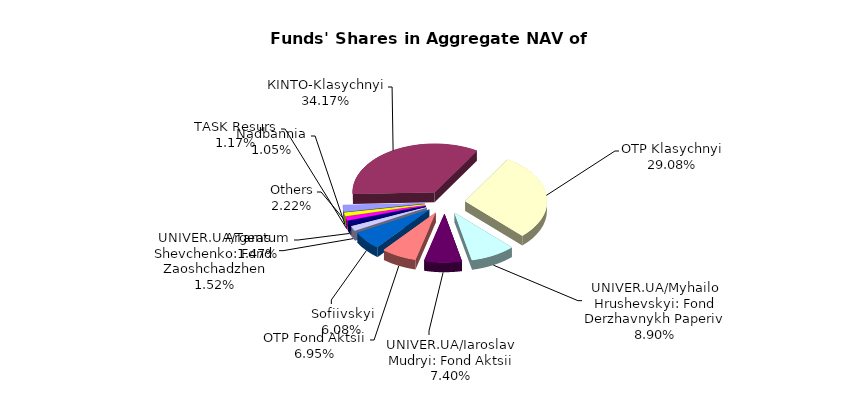
| Category | Series 0 | Series 1 |
|---|---|---|
| Others | 1988615.56 | 0.018 |
| КІNТО-Klasychnyi | 30630518.99 | 0.282 |
| OTP Klasychnyi | 26074277.39 | 0.24 |
| UNIVER.UA/Myhailo Hrushevskyi: Fond Derzhavnykh Paperiv | 7976471.37 | 0.073 |
| UNIVER.UA/Iaroslav Mudryi: Fond Aktsii | 6630772.23 | 0.061 |
| OTP Fond Aktsii | 6229451.08 | 0.057 |
| Sofiivskyi | 5449541.03 | 0.05 |
| UNIVER.UA/Taras Shevchenko: Fond Zaoshchadzhen | 1366493.63 | 0.013 |
| Argentum | 1314926.4 | 0.012 |
| ТАSK Resurs | 1049489.1 | 0.01 |
| Nadbannia | 939126.46 | 0.009 |